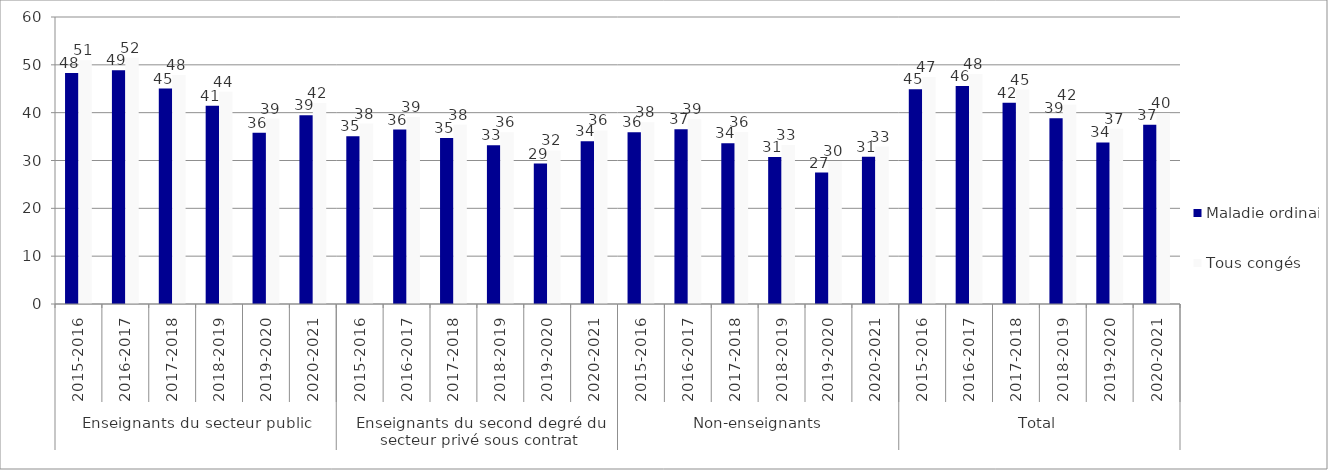
| Category | Maladie ordinaire | Tous congés |
|---|---|---|
| 0 | 48.28 | 50.98 |
| 1 | 48.88 | 51.5 |
| 2 | 45.04 | 47.86 |
| 3 | 41.45 | 44.38 |
| 4 | 35.82 | 38.78 |
| 5 | 39.47 | 42.02 |
| 6 | 35.08 | 37.72 |
| 7 | 36.47 | 39.11 |
| 8 | 34.72 | 37.5 |
| 9 | 33.19 | 35.92 |
| 10 | 29.36 | 32.1 |
| 11 | 34.05 | 36.29 |
| 12 | 35.93 | 38.02 |
| 13 | 36.54 | 38.64 |
| 14 | 33.63 | 35.95 |
| 15 | 30.74 | 33.24 |
| 16 | 27.49 | 29.91 |
| 17 | 30.81 | 32.91 |
| 18 | 44.89 | 47.47 |
| 19 | 45.56 | 48.09 |
| 20 | 42.09 | 44.82 |
| 21 | 38.82 | 41.66 |
| 22 | 33.77 | 36.62 |
| 23 | 37.46 | 39.9 |